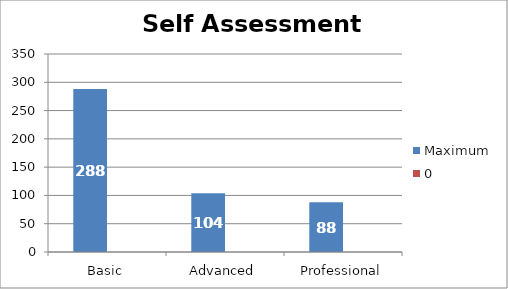
| Category | Maximum | 0 |
|---|---|---|
| Basic | 288 | 0 |
| Advanced | 104 | 0 |
| Professional | 88 | 0 |